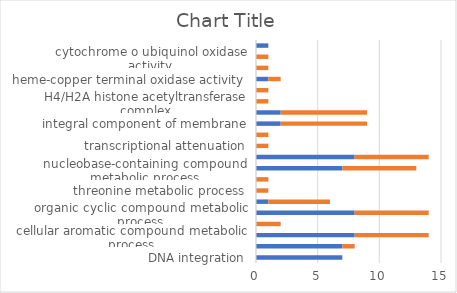
| Category | up | down |
|---|---|---|
| DNA integration | 7 | 0 |
| DNA metabolic process | 7 | 1 |
| cellular aromatic compound metabolic process | 8 | 6 |
| electron transport chain | 0 | 2 |
| organic cyclic compound metabolic process | 8 | 6 |
| multi-organism process | 1 | 5 |
| threonine metabolic process | 0 | 1 |
| threonine biosynthetic process | 0 | 1 |
| nucleobase-containing compound metabolic process | 7 | 6 |
| heterocycle metabolic process | 8 | 6 |
| transcriptional attenuation | 0 | 1 |
| transcriptional attenuation by ribosome | 0 | 1 |
| integral component of membrane | 2 | 7 |
| intrinsic component of membrane | 2 | 7 |
| H4/H2A histone acetyltransferase complex | 0 | 1 |
| H4 histone acetyltransferase complex | 0 | 1 |
| heme-copper terminal oxidase activity | 1 | 1 |
| alpha-amylase inhibitor activity | 0 | 1 |
| cytochrome o ubiquinol oxidase activity | 0 | 1 |
| heme transporter activity | 1 | 0 |